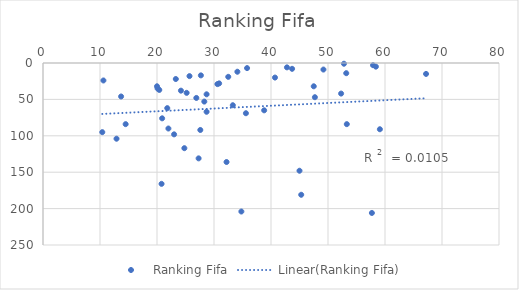
| Category | Ranking Fifa |
|---|---|
| 67.2 | 15 |
| 42.8 | 6 |
| 53.2 | 14 |
| 52.8 | 1 |
| 49.2 | 9 |
| 52.3 | 42 |
| 57.9 | 3 |
| 38.8 | 65 |
| 40.7 | 20 |
| 58.4 | 5 |
| 47.7 | 47 |
| 20.1 | 35 |
| 43.7 | 8 |
| 26.9 | 48 |
| 30.6 | 29 |
| 27.7 | 17 |
| 35.8 | 7 |
| 34.1 | 12 |
| 47.5 | 32 |
| 25.2 | 41 |
| 25.7 | 18 |
| 23.0 | 98 |
| 20.4 | 37 |
| 59.1 | 91 |
| 28.7 | 43 |
| 33.3 | 58 |
| 32.2 | 136 |
| 28.3 | 53 |
| 27.6 | 92 |
| 24.2 | 38 |
| 35.6 | 69 |
| 30.9 | 28 |
| 21.8 | 62 |
| 24.8 | 117 |
| 12.9 | 104 |
| 20.8 | 166 |
| 20.9 | 76 |
| 28.7 | 67 |
| 45.3 | 181 |
| 13.7 | 46 |
| 45.0 | 148 |
| 27.3 | 131 |
| 53.3 | 84 |
| 14.5 | 84 |
| 23.3 | 22 |
| 22.0 | 90 |
| 20.0 | 32 |
| 10.6 | 24 |
| 32.5 | 19 |
| 10.4 | 95 |
| 57.7 | 206 |
| 34.8 | 204 |